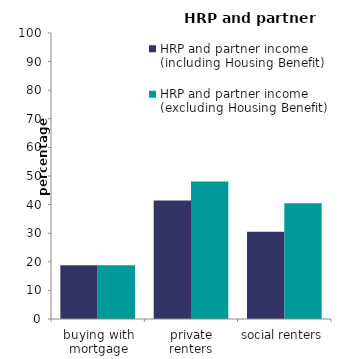
| Category | HRP and partner income 
(including Housing Benefit) | HRP and partner income 
(excluding Housing Benefit) |
|---|---|---|
| buying with mortgage | 18.774 | 18.774 |
| private renters | 41.422 | 48.073 |
| social renters | 30.534 | 40.438 |